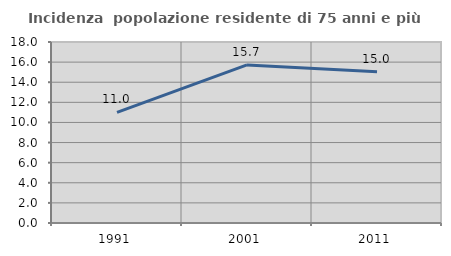
| Category | Incidenza  popolazione residente di 75 anni e più |
|---|---|
| 1991.0 | 10.994 |
| 2001.0 | 15.718 |
| 2011.0 | 15.044 |